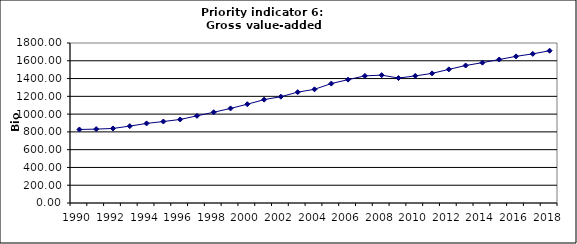
| Category | Gross value-added services, Bio Euro (EC95) |
|---|---|
| 1990 | 827.007 |
| 1991 | 831.369 |
| 1992 | 838.783 |
| 1993 | 865.103 |
| 1994 | 895.234 |
| 1995 | 916.585 |
| 1996 | 939.814 |
| 1997 | 980.638 |
| 1998 | 1020.972 |
| 1999 | 1063.846 |
| 2000 | 1111.365 |
| 2001 | 1162.908 |
| 2002 | 1196.055 |
| 2003 | 1247.046 |
| 2004 | 1279.131 |
| 2005 | 1343.548 |
| 2006 | 1387.884 |
| 2007 | 1430.039 |
| 2008 | 1438.536 |
| 2009 | 1405.773 |
| 2010 | 1429.705 |
| 2011 | 1458.11 |
| 2012 | 1503.357 |
| 2013 | 1546.858 |
| 2014 | 1578.715 |
| 2015 | 1614.271 |
| 2016 | 1649.772 |
| 2017 | 1677.742 |
| 2018 | 1712.994 |